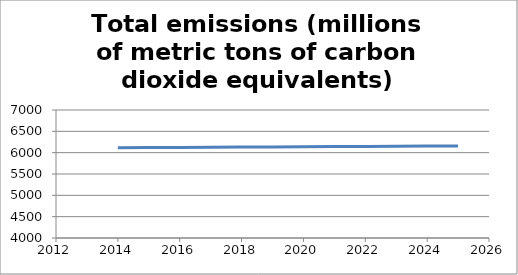
| Category | Total emissions (millions of metric tons of carbon dioxide equivalents) |
|---|---|
| 2014.0 | 6114.3 |
| 2015.0 | 6118.218 |
| 2016.0 | 6122.139 |
| 2017.0 | 6126.062 |
| 2018.0 | 6129.987 |
| 2019.0 | 6133.915 |
| 2020.0 | 6137.846 |
| 2021.0 | 6141.779 |
| 2022.0 | 6145.714 |
| 2023.0 | 6149.653 |
| 2024.0 | 6153.593 |
| 2025.0 | 6157.536 |